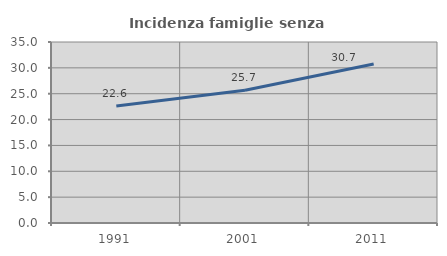
| Category | Incidenza famiglie senza nuclei |
|---|---|
| 1991.0 | 22.633 |
| 2001.0 | 25.665 |
| 2011.0 | 30.745 |